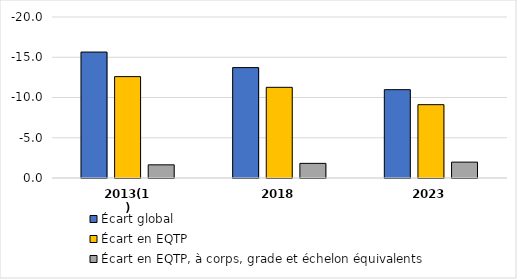
| Category | Écart global | Écart en EQTP | Écart en EQTP, à corps, grade et échelon équivalents |
|---|---|---|---|
| 2013(1) | -15.646 | -12.593 | -1.635 |
| 2018 | -13.713 | -11.264 | -1.818 |
| 2023 | -10.972 | -9.109 | -1.973 |